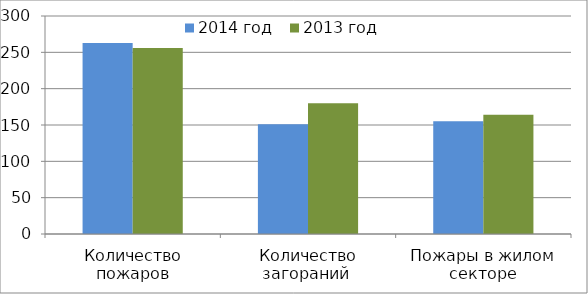
| Category | 2014 год | 2013 год |
|---|---|---|
| Количество пожаров | 263 | 256 |
| Количество загораний  | 151 | 180 |
| Пожары в жилом секторе | 155 | 164 |